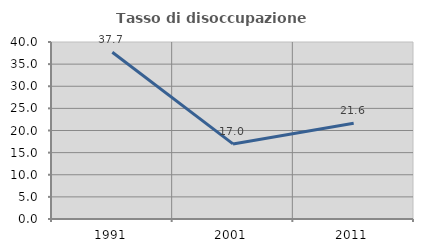
| Category | Tasso di disoccupazione giovanile  |
|---|---|
| 1991.0 | 37.684 |
| 2001.0 | 16.97 |
| 2011.0 | 21.622 |